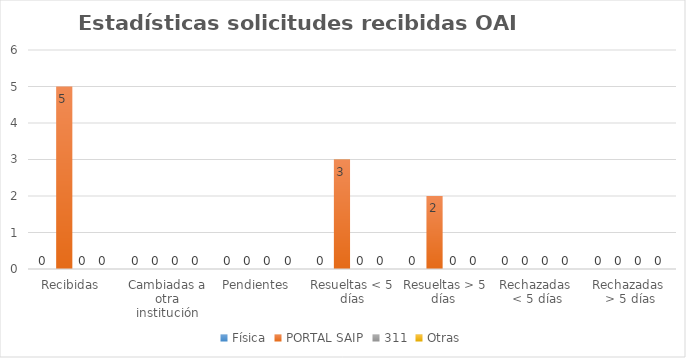
| Category | Física | PORTAL SAIP | 311 | Otras |
|---|---|---|---|---|
| Recibidas  | 0 | 5 | 0 | 0 |
| Cambiadas a otra institución | 0 | 0 | 0 | 0 |
| Pendientes  | 0 | 0 | 0 | 0 |
| Resueltas < 5 días | 0 | 3 | 0 | 0 |
| Resueltas > 5 días  | 0 | 2 | 0 | 0 |
| Rechazadas  < 5 días | 0 | 0 | 0 | 0 |
| Rechazadas  > 5 días | 0 | 0 | 0 | 0 |